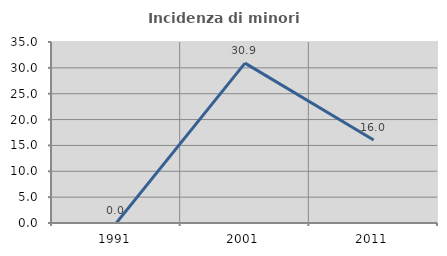
| Category | Incidenza di minori stranieri |
|---|---|
| 1991.0 | 0 |
| 2001.0 | 30.909 |
| 2011.0 | 16.038 |